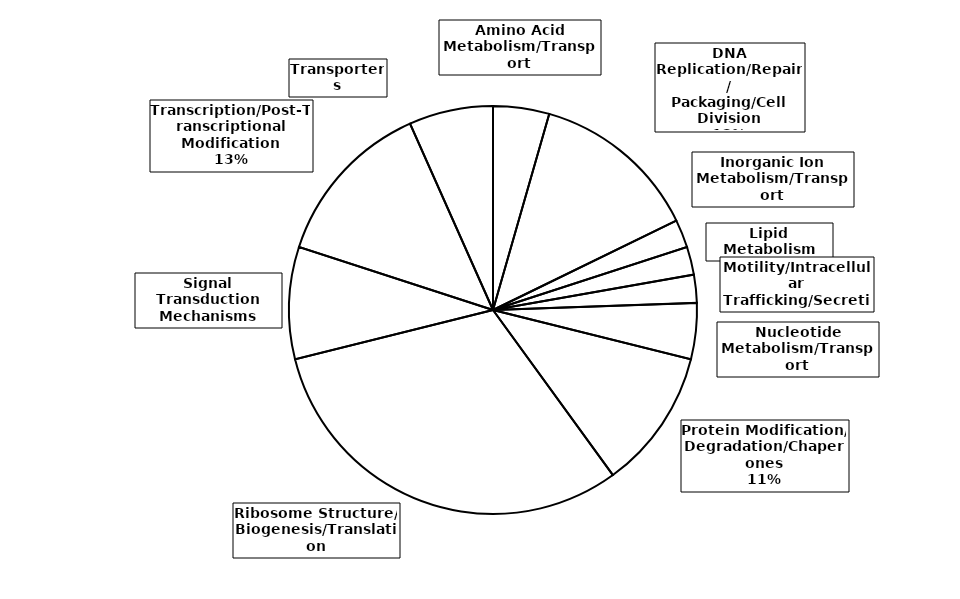
| Category | Series 0 |
|---|---|
| Amino Acid Metabolism/Transport | 2 |
| DNA Replication/Repair/
Packaging/Cell Division | 6 |
| Inorganic Ion Metabolism/Transport | 1 |
| Lipid Metabolism | 1 |
| Motility/Intracellular Trafficking/Secretion | 1 |
| Nucleotide Metabolism/Transport | 2 |
| Protein Modification/
Degradation/Chaperones | 5 |
| Ribosome Structure/
Biogenesis/Translation | 14 |
| Signal Transduction Mechanisms | 4 |
| Transcription/Post-Transcriptional Modification | 6 |
| Transporters | 3 |